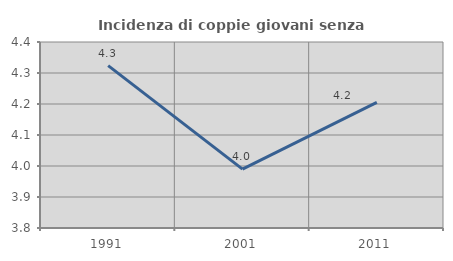
| Category | Incidenza di coppie giovani senza figli |
|---|---|
| 1991.0 | 4.324 |
| 2001.0 | 3.99 |
| 2011.0 | 4.205 |